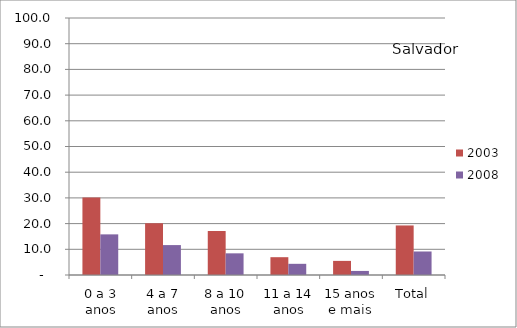
| Category | 2003 | 2008 |
|---|---|---|
| 0 a 3 anos | 30.18 | 15.81 |
| 4 a 7 anos | 20.1 | 11.64 |
| 8 a 10 anos | 17.11 | 8.43 |
| 11 a 14 anos | 6.93 | 4.35 |
| 15 anos e mais | 5.49 | 1.58 |
| Total | 19.28 | 9.15 |